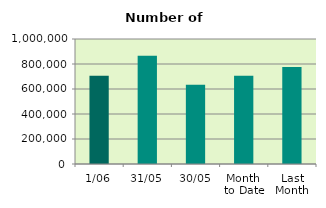
| Category | Series 0 |
|---|---|
| 1/06 | 706186 |
| 31/05 | 865006 |
| 30/05 | 633084 |
| Month 
to Date | 706186 |
| Last
Month | 776305.545 |